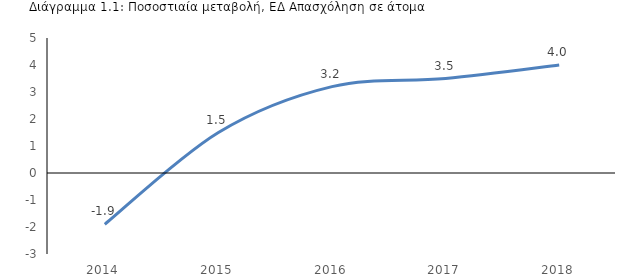
| Category | Απασχόληση, ΕΔ (άτομα, Στατιστική Υπηρεσία) % |
|---|---|
| 2014.0 | -1.9 |
| 2015.0 | 1.5 |
| 2016.0 | 3.2 |
| 2017.0 | 3.5 |
| 2018.0 | 4 |